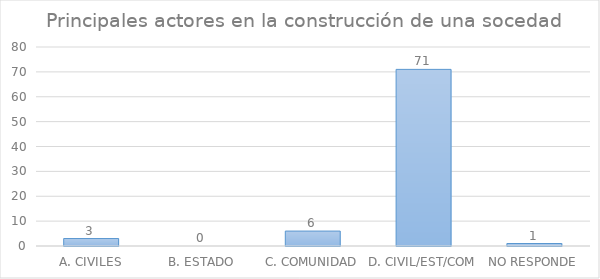
| Category | Series 0 |
|---|---|
| A. CIVILES | 3 |
| B. ESTADO | 0 |
| C. COMUNIDAD | 6 |
| D. CIVIL/EST/COM | 71 |
| NO RESPONDE | 1 |